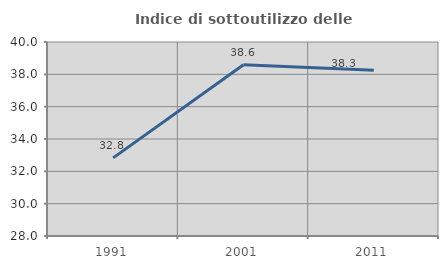
| Category | Indice di sottoutilizzo delle abitazioni  |
|---|---|
| 1991.0 | 32.834 |
| 2001.0 | 38.595 |
| 2011.0 | 38.257 |